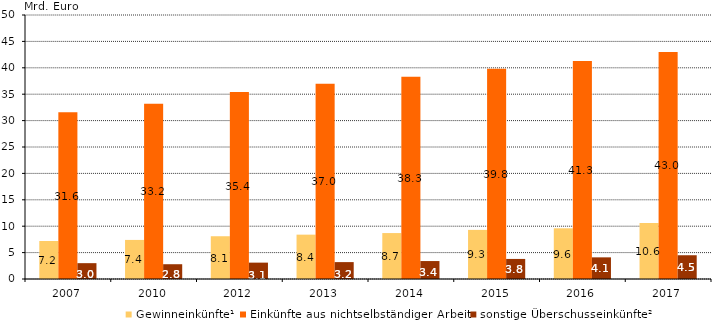
| Category | Gewinneinkünfte¹ | Einkünfte aus nichtselbständiger Arbeit | sonstige Überschusseinkünfte² |
|---|---|---|---|
| 2007.0 | 7.2 | 31.6 | 3 |
| 2010.0 | 7.4 | 33.2 | 2.8 |
| 2012.0 | 8.1 | 35.4 | 3.1 |
| 2013.0 | 8.4 | 37 | 3.2 |
| 2014.0 | 8.7 | 38.3 | 3.4 |
| 2015.0 | 9.3 | 39.8 | 3.8 |
| 2016.0 | 9.6 | 41.3 | 4.1 |
| 2017.0 | 10.6 | 43 | 4.5 |